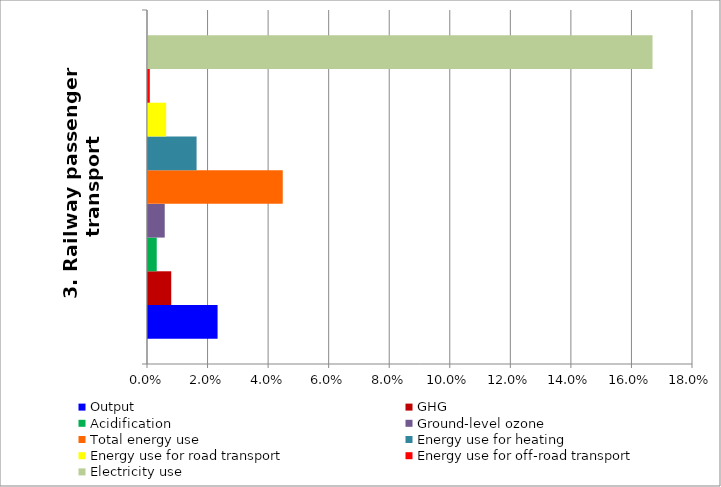
| Category | Output | GHG | Acidification | Ground-level ozone | Total energy use | Energy use for heating | Energy use for road transport | Energy use for off-road transport | Electricity use |
|---|---|---|---|---|---|---|---|---|---|
| 3. Railway passenger transport | 0.023 | 0.008 | 0.003 | 0.006 | 0.045 | 0.016 | 0.006 | 0.001 | 0.167 |